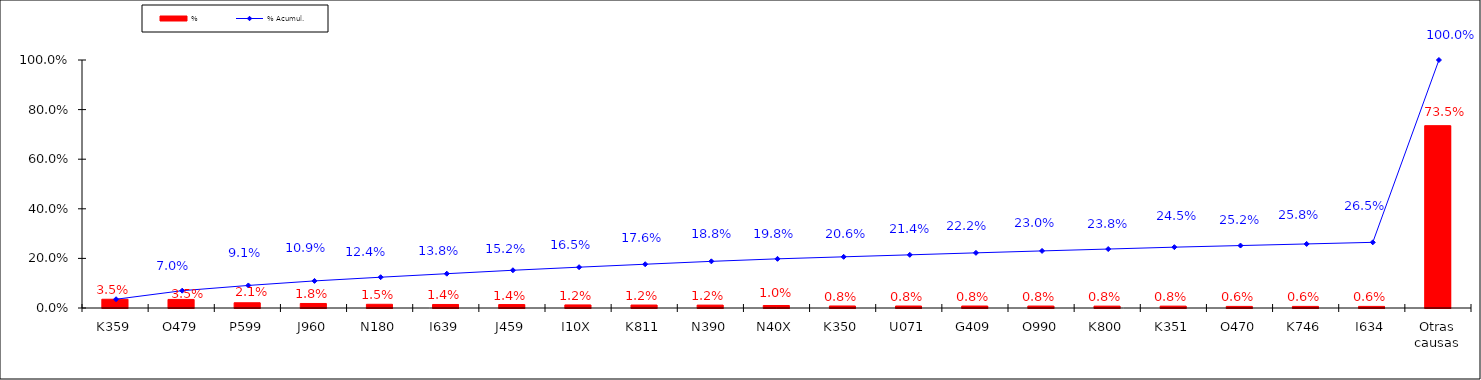
| Category | % |
|---|---|
| K359 | 0.035 |
| O479 | 0.035 |
| P599 | 0.021 |
| J960 | 0.018 |
| N180 | 0.015 |
| I639 | 0.014 |
| J459 | 0.014 |
| I10X | 0.012 |
| K811 | 0.012 |
| N390 | 0.012 |
| N40X | 0.01 |
| K350 | 0.008 |
| U071 | 0.008 |
| G409 | 0.008 |
| O990 | 0.008 |
| K800 | 0.008 |
| K351 | 0.008 |
| O470 | 0.006 |
| K746 | 0.006 |
| I634 | 0.006 |
| Otras causas | 0.735 |